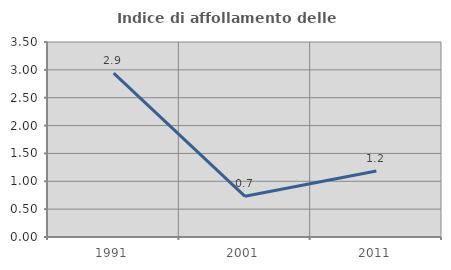
| Category | Indice di affollamento delle abitazioni  |
|---|---|
| 1991.0 | 2.941 |
| 2001.0 | 0.73 |
| 2011.0 | 1.186 |